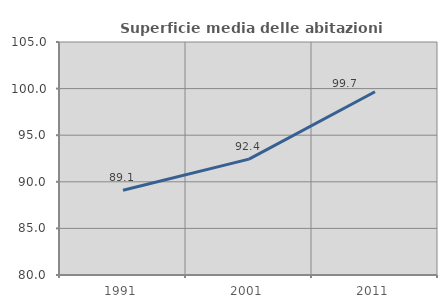
| Category | Superficie media delle abitazioni occupate |
|---|---|
| 1991.0 | 89.1 |
| 2001.0 | 92.437 |
| 2011.0 | 99.66 |